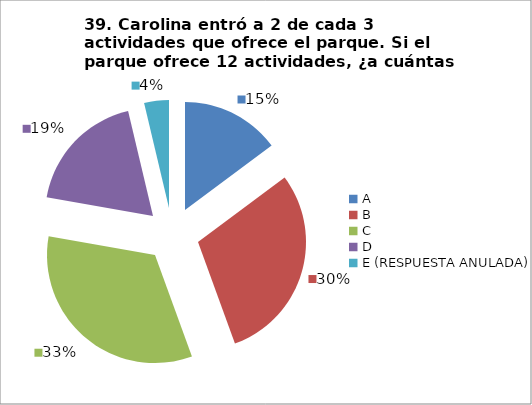
| Category | CANTIDAD DE RESPUESTAS PREGUNTA (39) | PORCENTAJE |
|---|---|---|
| A | 4 | 0.148 |
| B | 8 | 0.296 |
| C | 9 | 0.333 |
| D | 5 | 0.185 |
| E (RESPUESTA ANULADA) | 1 | 0.037 |